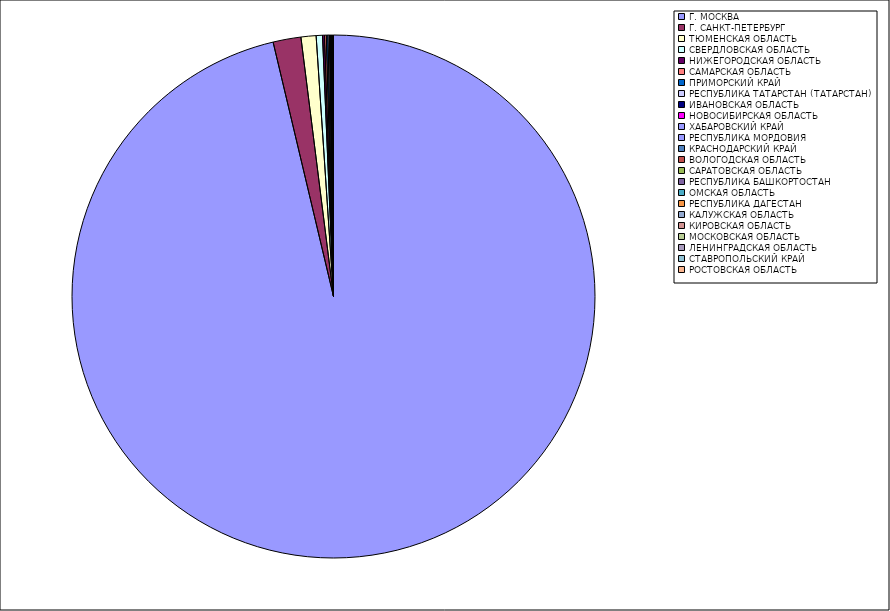
| Category | Оборот |
|---|---|
| Г. МОСКВА | 96.28 |
| Г. САНКТ-ПЕТЕРБУРГ | 1.72 |
| ТЮМЕНСКАЯ ОБЛАСТЬ | 0.93 |
| СВЕРДЛОВСКАЯ ОБЛАСТЬ | 0.39 |
| НИЖЕГОРОДСКАЯ ОБЛАСТЬ | 0.12 |
| САМАРСКАЯ ОБЛАСТЬ | 0.11 |
| ПРИМОРСКИЙ КРАЙ | 0.1 |
| РЕСПУБЛИКА ТАТАРСТАН (ТАТАРСТАН) | 0.09 |
| ИВАНОВСКАЯ ОБЛАСТЬ | 0.04 |
| НОВОСИБИРСКАЯ ОБЛАСТЬ | 0.03 |
| ХАБАРОВСКИЙ КРАЙ | 0.03 |
| РЕСПУБЛИКА МОРДОВИЯ | 0.02 |
| КРАСНОДАРСКИЙ КРАЙ | 0.02 |
| ВОЛОГОДСКАЯ ОБЛАСТЬ | 0.01 |
| САРАТОВСКАЯ ОБЛАСТЬ | 0.01 |
| РЕСПУБЛИКА БАШКОРТОСТАН | 0.01 |
| ОМСКАЯ ОБЛАСТЬ | 0.01 |
| РЕСПУБЛИКА ДАГЕСТАН | 0.01 |
| КАЛУЖСКАЯ ОБЛАСТЬ | 0.01 |
| КИРОВСКАЯ ОБЛАСТЬ | 0.01 |
| МОСКОВСКАЯ ОБЛАСТЬ | 0.01 |
| ЛЕНИНГРАДСКАЯ ОБЛАСТЬ | 0.01 |
| СТАВРОПОЛЬСКИЙ КРАЙ | 0.01 |
| РОСТОВСКАЯ ОБЛАСТЬ | 0.01 |